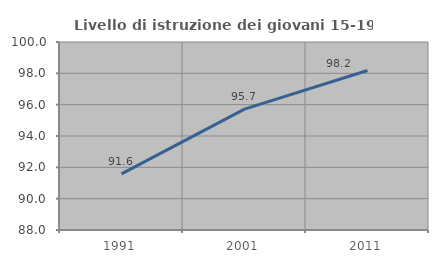
| Category | Livello di istruzione dei giovani 15-19 anni |
|---|---|
| 1991.0 | 91.579 |
| 2001.0 | 95.714 |
| 2011.0 | 98.182 |